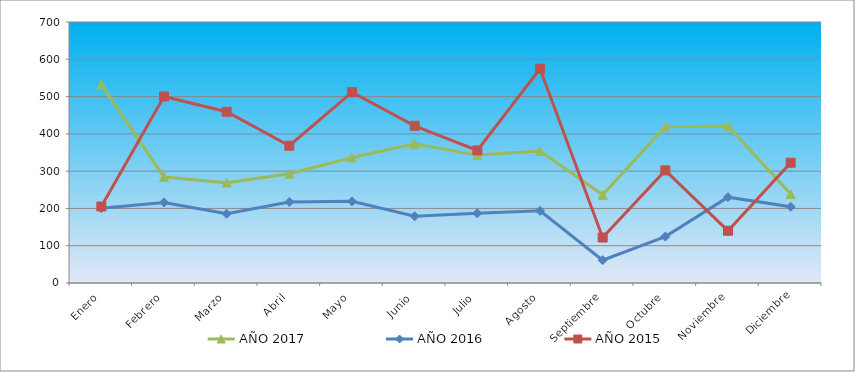
| Category | AÑO 2017 | AÑO 2016 | AÑO 2015 |
|---|---|---|---|
| Enero | 531.9 | 200.635 | 205.138 |
| Febrero | 284.403 | 216.069 | 500.308 |
| Marzo | 269.206 | 185.669 | 459.28 |
| Abril | 293.088 | 217.256 | 368.108 |
| Mayo | 336.508 | 219.022 | 511.704 |
| Junio | 373.415 | 178.998 | 421.672 |
| Julio | 343.021 | 186.78 | 355.572 |
| Agosto | 353.876 | 193.451 | 574.385 |
| Septiembre | 236.641 | 61.148 | 121.943 |
| Octubre | 419.007 | 124.52 | 302.008 |
| Noviembre | 421.178 | 230.14 | 140.177 |
| Diciembre | 238.812 | 204.569 | 322.522 |